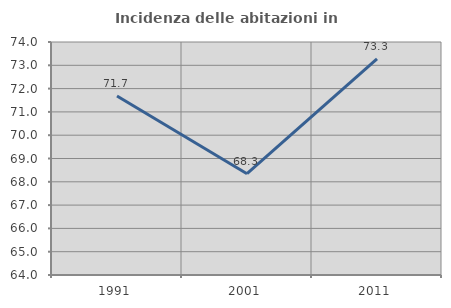
| Category | Incidenza delle abitazioni in proprietà  |
|---|---|
| 1991.0 | 71.681 |
| 2001.0 | 68.346 |
| 2011.0 | 73.274 |